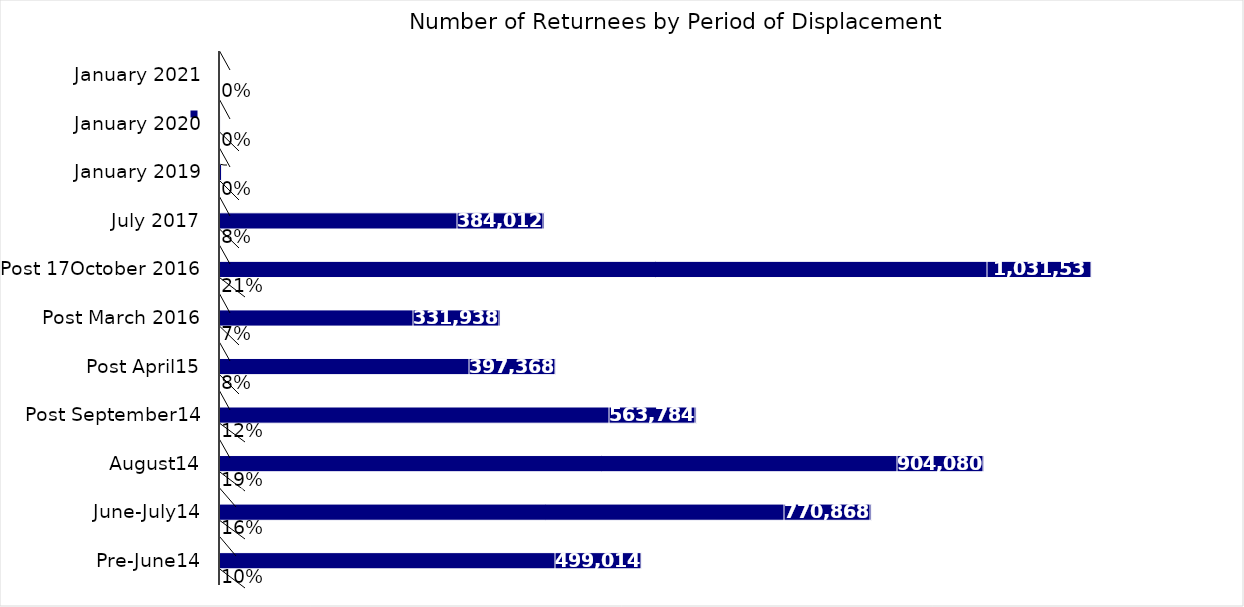
| Category | Sum of % | Sum of Returnees Individuals  | Sum of rank |
|---|---|---|---|
| Pre-June14 | 0.102 | 499014 | 11 |
| June-July14 | 0.158 | 770868 | 10 |
| August14 | 0.185 | 904080 | 9 |
| Post September14 | 0.115 | 563784 | 8 |
| Post April15 | 0.081 | 397368 | 7 |
| Post March 2016 | 0.068 | 331938 | 6 |
| Post 17October 2016 | 0.211 | 1031538 | 5 |
| July 2017 | 0.079 | 384012 | 4 |
| January 2019 | 0 | 1890 | 3 |
| January 2020 | 0 | 120 | 2 |
| January 2021 | 0 | 0 | 1 |